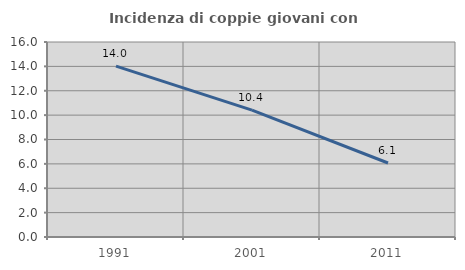
| Category | Incidenza di coppie giovani con figli |
|---|---|
| 1991.0 | 14.021 |
| 2001.0 | 10.415 |
| 2011.0 | 6.071 |